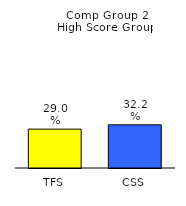
| Category | Series 0 |
|---|---|
| TFS | 0.29 |
| CSS | 0.322 |